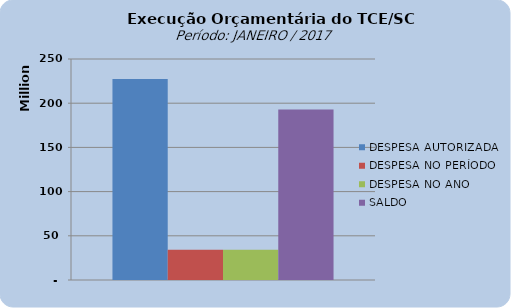
| Category | DESPESA AUTORIZADA | DESPESA NO PERÍODO | DESPESA NO ANO | SALDO |
|---|---|---|---|---|
| 0 | 227318041.32 | 34303524.23 | 34303524.23 | 193014517.09 |